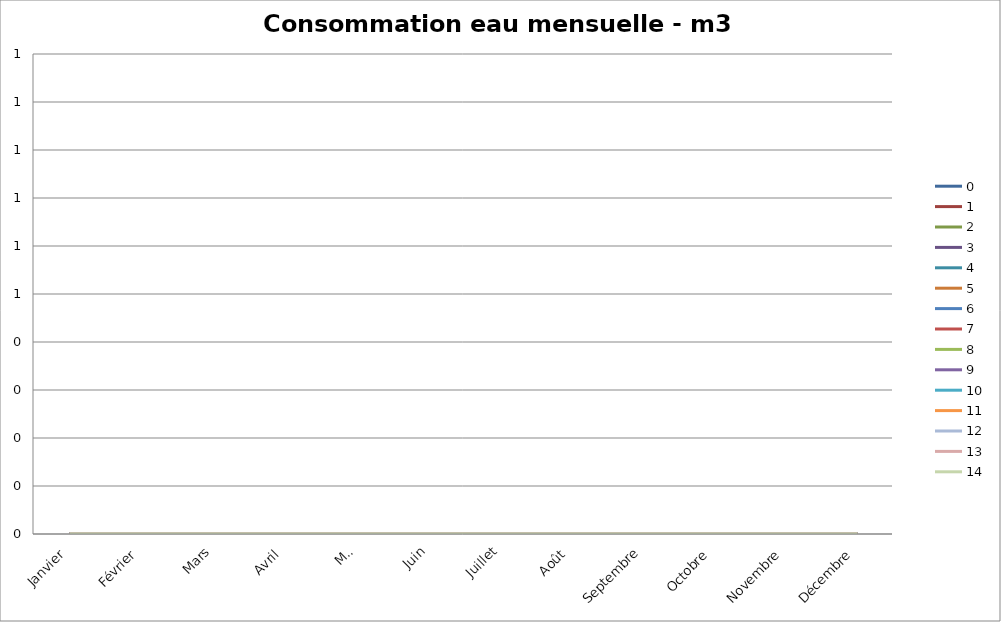
| Category | 0 | 1 | 2 | 3 | 4 | 5 | 6 | 7 | 8 | 9 | 10 | 11 | 12 | 13 | 14 |
|---|---|---|---|---|---|---|---|---|---|---|---|---|---|---|---|
| Janvier | 0 | 0 | 0 | 0 | 0 | 0 | 0 | 0 | 0 | 0 | 0 | 0 | 0 | 0 | 0 |
| Février | 0 | 0 | 0 | 0 | 0 | 0 | 0 | 0 | 0 | 0 | 0 | 0 | 0 | 0 | 0 |
| Mars | 0 | 0 | 0 | 0 | 0 | 0 | 0 | 0 | 0 | 0 | 0 | 0 | 0 | 0 | 0 |
| Avril | 0 | 0 | 0 | 0 | 0 | 0 | 0 | 0 | 0 | 0 | 0 | 0 | 0 | 0 | 0 |
| Mai | 0 | 0 | 0 | 0 | 0 | 0 | 0 | 0 | 0 | 0 | 0 | 0 | 0 | 0 | 0 |
| Juin | 0 | 0 | 0 | 0 | 0 | 0 | 0 | 0 | 0 | 0 | 0 | 0 | 0 | 0 | 0 |
| Juillet | 0 | 0 | 0 | 0 | 0 | 0 | 0 | 0 | 0 | 0 | 0 | 0 | 0 | 0 | 0 |
| Août | 0 | 0 | 0 | 0 | 0 | 0 | 0 | 0 | 0 | 0 | 0 | 0 | 0 | 0 | 0 |
| Septembre | 0 | 0 | 0 | 0 | 0 | 0 | 0 | 0 | 0 | 0 | 0 | 0 | 0 | 0 | 0 |
| Octobre | 0 | 0 | 0 | 0 | 0 | 0 | 0 | 0 | 0 | 0 | 0 | 0 | 0 | 0 | 0 |
| Novembre | 0 | 0 | 0 | 0 | 0 | 0 | 0 | 0 | 0 | 0 | 0 | 0 | 0 | 0 | 0 |
| Décembre | 0 | 0 | 0 | 0 | 0 | 0 | 0 | 0 | 0 | 0 | 0 | 0 | 0 | 0 | 0 |